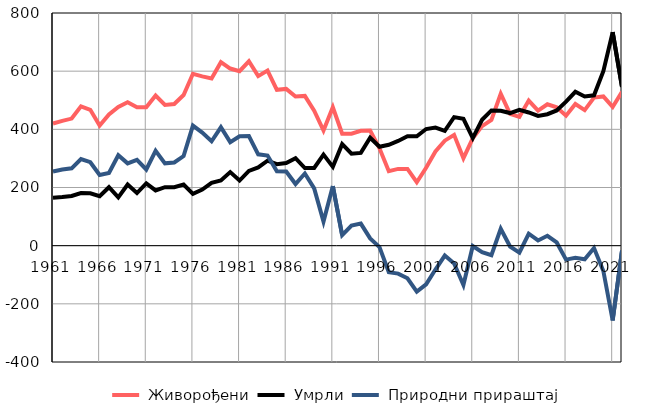
| Category |  Живорођени |  Умрли |  Природни прираштај |
|---|---|---|---|
| 1961.0 | 420 | 165 | 255 |
| 1962.0 | 429 | 167 | 262 |
| 1963.0 | 437 | 171 | 266 |
| 1964.0 | 479 | 181 | 298 |
| 1965.0 | 467 | 180 | 287 |
| 1966.0 | 413 | 170 | 243 |
| 1967.0 | 451 | 201 | 250 |
| 1968.0 | 477 | 166 | 311 |
| 1969.0 | 493 | 210 | 283 |
| 1970.0 | 476 | 181 | 295 |
| 1971.0 | 476 | 214 | 262 |
| 1972.0 | 516 | 190 | 326 |
| 1973.0 | 484 | 201 | 283 |
| 1974.0 | 487 | 201 | 286 |
| 1975.0 | 518 | 210 | 308 |
| 1976.0 | 591 | 178 | 413 |
| 1977.0 | 582 | 193 | 389 |
| 1978.0 | 575 | 216 | 359 |
| 1979.0 | 631 | 224 | 407 |
| 1980.0 | 609 | 253 | 356 |
| 1981.0 | 600 | 224 | 376 |
| 1982.0 | 634 | 257 | 377 |
| 1983.0 | 583 | 269 | 314 |
| 1984.0 | 602 | 292 | 310 |
| 1985.0 | 536 | 280 | 256 |
| 1986.0 | 539 | 284 | 255 |
| 1987.0 | 513 | 301 | 212 |
| 1988.0 | 515 | 267 | 248 |
| 1989.0 | 464 | 267 | 197 |
| 1990.0 | 396 | 313 | 83 |
| 1991.0 | 476 | 271 | 205 |
| 1992.0 | 385 | 349 | 36 |
| 1993.0 | 385 | 316 | 69 |
| 1994.0 | 395 | 319 | 76 |
| 1995.0 | 396 | 371 | 25 |
| 1996.0 | 335 | 340 | -5 |
| 1997.0 | 256 | 347 | -91 |
| 1998.0 | 264 | 360 | -96 |
| 1999.0 | 264 | 376 | -112 |
| 2000.0 | 218 | 376 | -158 |
| 2001.0 | 268 | 401 | -133 |
| 2002.0 | 324 | 406 | -82 |
| 2003.0 | 361 | 395 | -34 |
| 2004.0 | 381 | 442 | -61 |
| 2005.0 | 301 | 436 | -135 |
| 2006.0 | 369 | 370 | -1 |
| 2007.0 | 411 | 433 | -22 |
| 2008.0 | 432 | 465 | -33 |
| 2009.0 | 522 | 464 | 58 |
| 2010.0 | 453 | 456 | -3 |
| 2011.0 | 443 | 467 | -24 |
| 2012.0 | 499 | 458 | 41 |
| 2013.0 | 464 | 446 | 18 |
| 2014.0 | 486 | 452 | 34 |
| 2015.0 | 476 | 465 | 11 |
| 2016.0 | 447 | 495 | -48 |
| 2017.0 | 487 | 529 | -42 |
| 2018.0 | 466 | 513 | -47 |
| 2019.0 | 509 | 517 | -8 |
| 2020.0 | 513 | 600 | -87 |
| 2021.0 | 477 | 734 | -257 |
| 2022.0 | 529 | 546 | -17 |